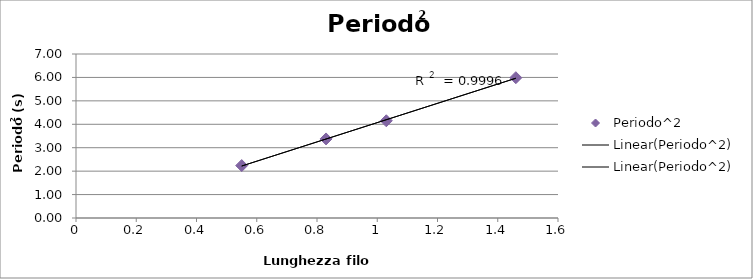
| Category | Periodo^2 |
|---|---|
| 0.55 | 2.238 |
| 0.83 | 3.375 |
| 1.03 | 4.149 |
| 1.46 | 5.988 |